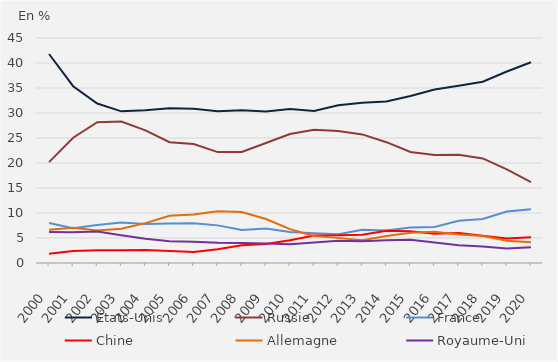
| Category | États-Unis | Russie | France | Chine | Allemagne | Royaume-Uni |
|---|---|---|---|---|---|---|
| 2000.0 | 41.801 | 20.166 | 7.999 | 1.871 | 6.646 | 6.207 |
| 2001.0 | 35.357 | 25.053 | 6.934 | 2.39 | 7.051 | 6.131 |
| 2002.0 | 31.888 | 28.162 | 7.622 | 2.574 | 6.522 | 6.285 |
| 2003.0 | 30.334 | 28.279 | 8.122 | 2.549 | 6.832 | 5.544 |
| 2004.0 | 30.561 | 26.513 | 7.795 | 2.61 | 7.975 | 4.848 |
| 2005.0 | 30.932 | 24.153 | 7.877 | 2.389 | 9.464 | 4.327 |
| 2006.0 | 30.867 | 23.785 | 7.973 | 2.202 | 9.679 | 4.272 |
| 2007.0 | 30.358 | 22.178 | 7.525 | 2.742 | 10.343 | 4.04 |
| 2008.0 | 30.538 | 22.215 | 6.619 | 3.552 | 10.206 | 4.016 |
| 2009.0 | 30.31 | 24.003 | 6.899 | 3.818 | 8.8 | 3.887 |
| 2010.0 | 30.792 | 25.797 | 6.18 | 4.547 | 6.765 | 3.77 |
| 2011.0 | 30.423 | 26.659 | 5.96 | 5.517 | 5.419 | 4.102 |
| 2012.0 | 31.529 | 26.399 | 5.76 | 5.53 | 5.025 | 4.442 |
| 2013.0 | 32.035 | 25.717 | 6.641 | 5.655 | 4.533 | 4.374 |
| 2014.0 | 32.322 | 24.163 | 6.524 | 6.436 | 5.415 | 4.567 |
| 2015.0 | 33.394 | 22.206 | 7.081 | 6.342 | 6.061 | 4.66 |
| 2016.0 | 34.68 | 21.608 | 7.203 | 5.848 | 6.256 | 4.088 |
| 2017.0 | 35.47 | 21.656 | 8.45 | 6.021 | 5.692 | 3.566 |
| 2018.0 | 36.243 | 20.916 | 8.797 | 5.439 | 5.415 | 3.29 |
| 2019.0 | 38.297 | 18.715 | 10.314 | 4.897 | 4.433 | 2.9 |
| 2020.0 | 40.16 | 16.196 | 10.755 | 5.167 | 4.158 | 3.168 |